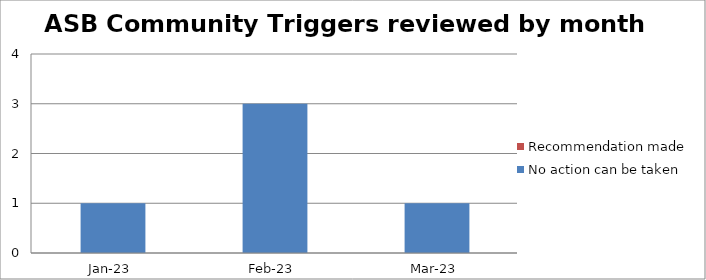
| Category | No action can be taken | Recommendation made |
|---|---|---|
| 2023-01-01 | 1 | 0 |
| 2023-02-01 | 3 | 0 |
| 2023-03-01 | 1 | 0 |